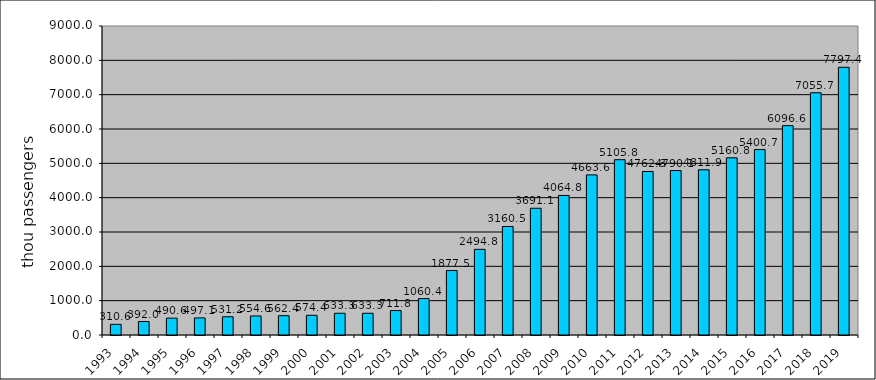
| Category | Series 0 |
|---|---|
| 1993.0 | 310.6 |
| 1994.0 | 392 |
| 1995.0 | 490.62 |
| 1996.0 | 497.13 |
| 1997.0 | 531.22 |
| 1998.0 | 554.62 |
| 1999.0 | 562.383 |
| 2000.0 | 574.356 |
| 2001.0 | 633.319 |
| 2002.0 | 633.319 |
| 2003.0 | 711.848 |
| 2004.0 | 1060.384 |
| 2005.0 | 1877.461 |
| 2006.0 | 2494.835 |
| 2007.0 | 3160.535 |
| 2008.0 | 3691.099 |
| 2009.0 | 4064.755 |
| 2010.0 | 4663.647 |
| 2011.0 | 5105.818 |
| 2012.0 | 4762.335 |
| 2013.0 | 4790.136 |
| 2014.0 | 4811.949 |
| 2015.0 | 5160.759 |
| 2016.0 | 5400.709 |
| 2017.0 | 6096.62 |
| 2018.0 | 7055.734 |
| 2019.0 | 7797.398 |